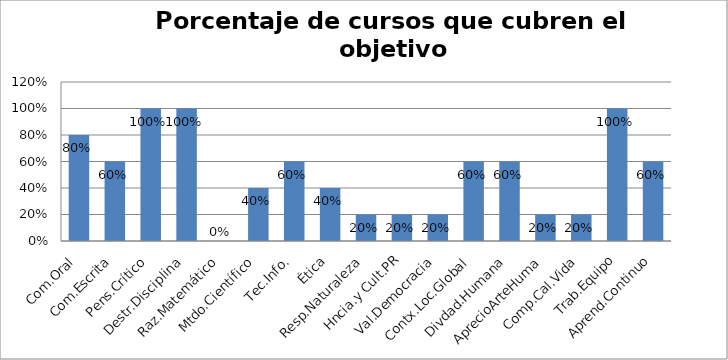
| Category | Series 0 |
|---|---|
| Com.Oral | 0.8 |
| Com.Escrita | 0.6 |
| Pens.Crítico | 1 |
| Destr.Disciplina | 1 |
| Raz.Matemático | 0 |
| Mtdo.Científico | 0.4 |
| Tec.Info. | 0.6 |
| Ética | 0.4 |
| Resp.Naturaleza | 0.2 |
| Hncia.y Cult.PR | 0.2 |
| Val.Democracia | 0.2 |
| Contx.Loc.Global | 0.6 |
| Divdad.Humana | 0.6 |
| AprecioArteHuma | 0.2 |
| Comp.Cal.Vida | 0.2 |
| Trab.Equipo | 1 |
| Aprend.Continuo | 0.6 |